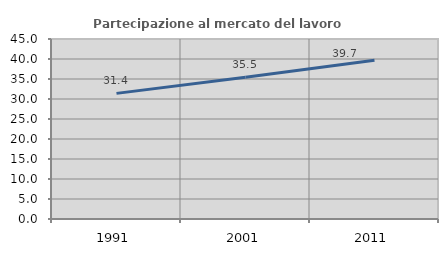
| Category | Partecipazione al mercato del lavoro  femminile |
|---|---|
| 1991.0 | 31.405 |
| 2001.0 | 35.462 |
| 2011.0 | 39.696 |